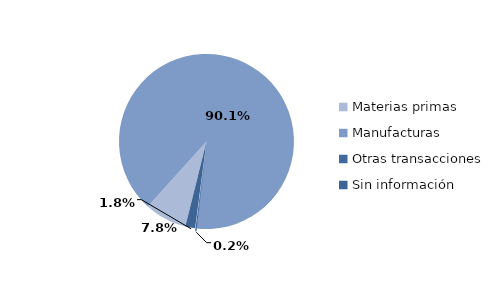
| Category | Series 0 |
|---|---|
| Materias primas | 658.86 |
| Manufacturas | 7599.988 |
| Otras transacciones | 20.869 |
| Sin información | 152.638 |